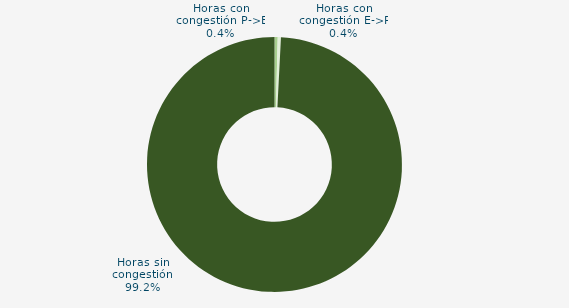
| Category | Horas con congestión E->P |
|---|---|
| Horas con congestión E->P | 0.403 |
| Horas con congestión P->E | 0.403 |
| Horas sin congestión | 99.194 |